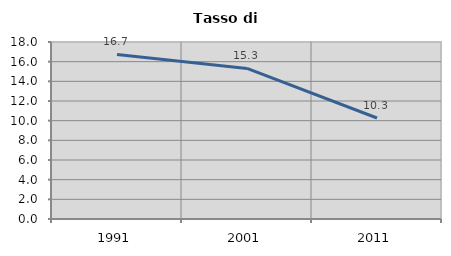
| Category | Tasso di disoccupazione   |
|---|---|
| 1991.0 | 16.739 |
| 2001.0 | 15.312 |
| 2011.0 | 10.27 |